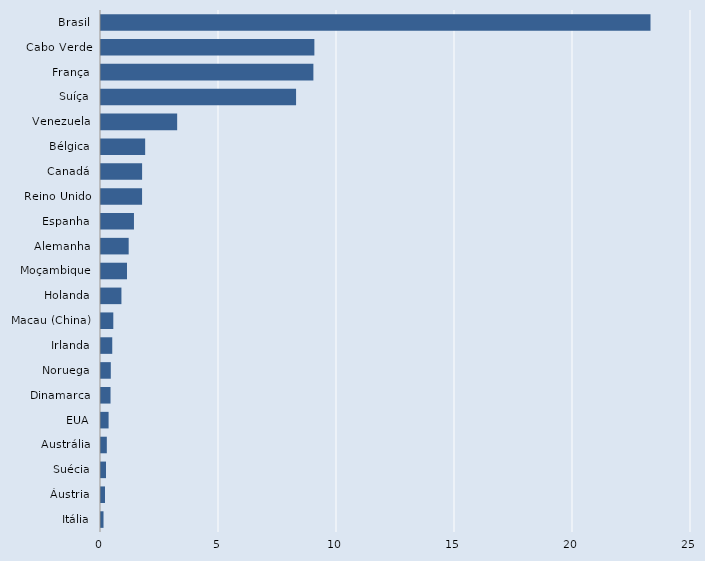
| Category | Series 0 |
|---|---|
| Itália | 0.107 |
| Áustria | 0.169 |
| Suécia | 0.212 |
| Austrália | 0.247 |
| EUA | 0.322 |
| Dinamarca | 0.404 |
| Noruega | 0.415 |
| Irlanda | 0.477 |
| Macau (China) | 0.521 |
| Holanda | 0.866 |
| Moçambique | 1.101 |
| Alemanha | 1.173 |
| Espanha | 1.397 |
| Reino Unido | 1.74 |
| Canadá | 1.742 |
| Bélgica | 1.871 |
| Venezuela | 3.227 |
| Suíça | 8.266 |
| França | 8.999 |
| Cabo Verde | 9.041 |
| Brasil | 23.284 |